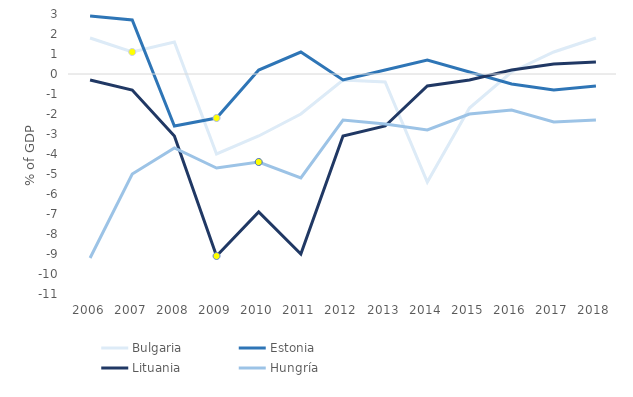
| Category | Bulgaria | Estonia | Lituania | Hungría |
|---|---|---|---|---|
| 2006.0 | 1.8 | 2.9 | -0.3 | -9.2 |
| 2007.0 | 1.1 | 2.7 | -0.8 | -5 |
| 2008.0 | 1.6 | -2.6 | -3.1 | -3.7 |
| 2009.0 | -4 | -2.2 | -9.1 | -4.7 |
| 2010.0 | -3.1 | 0.2 | -6.9 | -4.4 |
| 2011.0 | -2 | 1.1 | -9 | -5.2 |
| 2012.0 | -0.3 | -0.3 | -3.1 | -2.3 |
| 2013.0 | -0.4 | 0.2 | -2.6 | -2.5 |
| 2014.0 | -5.4 | 0.7 | -0.6 | -2.8 |
| 2015.0 | -1.7 | 0.1 | -0.3 | -2 |
| 2016.0 | 0.1 | -0.5 | 0.2 | -1.8 |
| 2017.0 | 1.1 | -0.8 | 0.5 | -2.4 |
| 2018.0 | 1.8 | -0.6 | 0.6 | -2.3 |